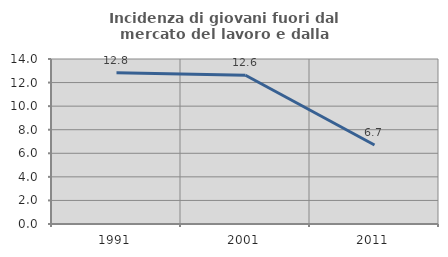
| Category | Incidenza di giovani fuori dal mercato del lavoro e dalla formazione  |
|---|---|
| 1991.0 | 12.832 |
| 2001.0 | 12.621 |
| 2011.0 | 6.707 |